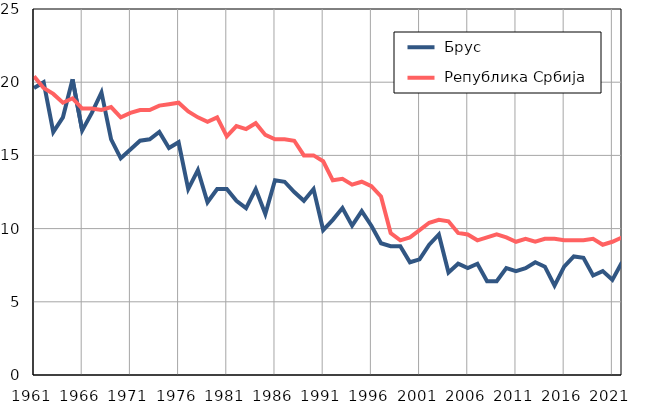
| Category |  Брус |  Република Србија |
|---|---|---|
| 1961.0 | 19.6 | 20.4 |
| 1962.0 | 20 | 19.6 |
| 1963.0 | 16.6 | 19.2 |
| 1964.0 | 17.6 | 18.6 |
| 1965.0 | 20.2 | 18.9 |
| 1966.0 | 16.7 | 18.2 |
| 1967.0 | 17.9 | 18.2 |
| 1968.0 | 19.3 | 18.1 |
| 1969.0 | 16.1 | 18.3 |
| 1970.0 | 14.8 | 17.6 |
| 1971.0 | 15.4 | 17.9 |
| 1972.0 | 16 | 18.1 |
| 1973.0 | 16.1 | 18.1 |
| 1974.0 | 16.6 | 18.4 |
| 1975.0 | 15.5 | 18.5 |
| 1976.0 | 15.9 | 18.6 |
| 1977.0 | 12.7 | 18 |
| 1978.0 | 14 | 17.6 |
| 1979.0 | 11.8 | 17.3 |
| 1980.0 | 12.7 | 17.6 |
| 1981.0 | 12.7 | 16.3 |
| 1982.0 | 11.9 | 17 |
| 1983.0 | 11.4 | 16.8 |
| 1984.0 | 12.7 | 17.2 |
| 1985.0 | 11 | 16.4 |
| 1986.0 | 13.3 | 16.1 |
| 1987.0 | 13.2 | 16.1 |
| 1988.0 | 12.5 | 16 |
| 1989.0 | 11.9 | 15 |
| 1990.0 | 12.7 | 15 |
| 1991.0 | 9.9 | 14.6 |
| 1992.0 | 10.6 | 13.3 |
| 1993.0 | 11.4 | 13.4 |
| 1994.0 | 10.2 | 13 |
| 1995.0 | 11.2 | 13.2 |
| 1996.0 | 10.2 | 12.9 |
| 1997.0 | 9 | 12.2 |
| 1998.0 | 8.8 | 9.7 |
| 1999.0 | 8.8 | 9.2 |
| 2000.0 | 7.7 | 9.4 |
| 2001.0 | 7.9 | 9.9 |
| 2002.0 | 8.9 | 10.4 |
| 2003.0 | 9.6 | 10.6 |
| 2004.0 | 7 | 10.5 |
| 2005.0 | 7.6 | 9.7 |
| 2006.0 | 7.3 | 9.6 |
| 2007.0 | 7.6 | 9.2 |
| 2008.0 | 6.4 | 9.4 |
| 2009.0 | 6.4 | 9.6 |
| 2010.0 | 7.3 | 9.4 |
| 2011.0 | 7.1 | 9.1 |
| 2012.0 | 7.3 | 9.3 |
| 2013.0 | 7.7 | 9.1 |
| 2014.0 | 7.4 | 9.3 |
| 2015.0 | 6.1 | 9.3 |
| 2016.0 | 7.4 | 9.2 |
| 2017.0 | 8.1 | 9.2 |
| 2018.0 | 8 | 9.2 |
| 2019.0 | 6.8 | 9.3 |
| 2020.0 | 7.1 | 8.9 |
| 2021.0 | 6.5 | 9.1 |
| 2022.0 | 7.7 | 9.4 |